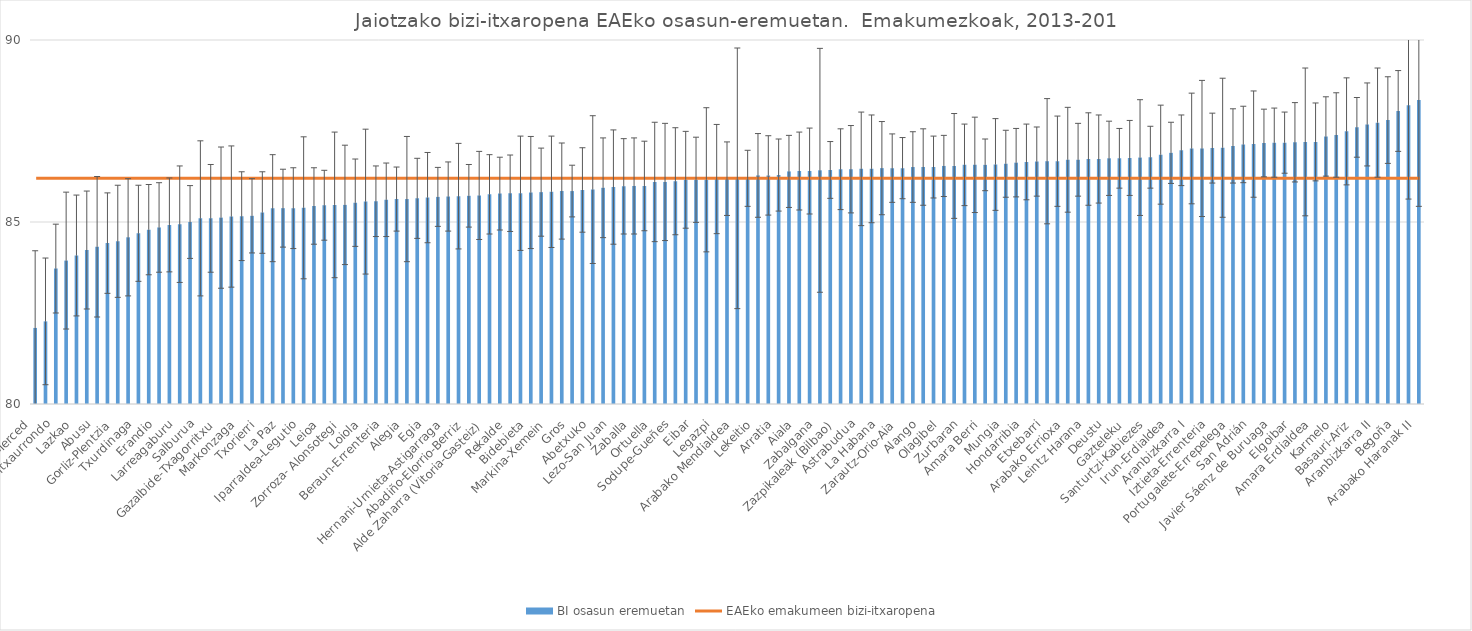
| Category | BI osasun eremuetan |
|---|---|
| La Merced  | 82.09 |
| Miribilla  | 82.27 |
| Intxaurrondo  | 83.72 |
| Otxarkoaga  | 83.94 |
| Lazkao  | 84.08 |
| Torrekua  | 84.23 |
| Abusu  | 84.32 |
| Santurtzi-Erdialdea-Mamariga  | 84.42 |
| Gorliz-Plentzia  | 84.47 |
| Kueto  | 84.58 |
| Txurdinaga  | 84.69 |
| Zuazo  | 84.79 |
| Erandio  | 84.85 |
| Portugalete-Buenavista  | 84.92 |
| Larreagaburu  | 84.94 |
| Zumaia-Zestoa-Getaria  | 85 |
| Salburua  | 85.1 |
| Zalla  | 85.1 |
| Gazalbide-Txagorritxu  | 85.12 |
| Lutxana  | 85.15 |
| Markonzaga  | 85.16 |
| Abanto-Muskiz  | 85.17 |
| Txorierri  | 85.26 |
| Balmaseda  | 85.38 |
| La Paz  | 85.38 |
| Altza-Roteta  | 85.38 |
| Iparraldea-Legutio  | 85.39 |
| Bermeo  | 85.44 |
| Leioa  | 85.46 |
| Urban  | 85.47 |
| Zorroza- Alonsotegi  | 85.47 |
| Ordizia  | 85.53 |
| Loiola  | 85.56 |
| Sopelana  | 85.57 |
| Beraun-Errenteria  | 85.61 |
| San Vicente  | 85.63 |
| Alegia  | 85.63 |
| Amorebieta  | 85.65 |
| Egia  | 85.67 |
| Durango  | 85.69 |
| Hernani-Urnieta-Astigarraga  | 85.7 |
| Oiartzun  | 85.71 |
| Abadiño-Elorrio-Berriz  | 85.72 |
| Arrontegi  | 85.73 |
| Alde Zaharra (Vitoria-Gasteiz)  | 85.76 |
| Basurtu  | 85.78 |
| Rekalde  | 85.79 |
| Deba  | 85.79 |
| Bidebieta  | 85.81 |
| Azkoitia  | 85.82 |
| Markina-Xemein  | 85.83 |
| Andoain  | 85.85 |
| Gros  | 85.85 |
| Tolosa  | 85.88 |
| Abetxuko  | 85.89 |
| Basauri-Kareaga  | 85.94 |
| Lezo-San Juan  | 85.96 |
| Lakuabizkarra  | 85.98 |
| Zaballa  | 85.99 |
| Arrigorriaga  | 85.99 |
| Ortuella  | 86.1 |
| Santutxu-Solokoetxe  | 86.1 |
| Sodupe-Gueñes  | 86.12 |
| Trapagaran  | 86.16 |
| Eibar  | 86.16 |
| Pasaia Antxo  | 86.16 |
| Legazpi  | 86.18 |
| Dumboa  | 86.19 |
| Arabako Mendialdea  | 86.2 |
| Etxaniz Suhiltzailea  | 86.2 |
| Lekeitio  | 86.28 |
| Ondarroa  | 86.28 |
| Arratia  | 86.29 |
| Gernika  | 86.39 |
| Aiala  | 86.4 |
| Gernikaldea  | 86.4 |
| Zabalgana  | 86.42 |
| Areeta  | 86.43 |
| Zazpikaleak (Bilbao)  | 86.45 |
| Alde Zaharra  | 86.45 |
| Astrabudua  | 86.46 |
| Ibarra  | 86.46 |
| La Habana  | 86.48 |
| Laudio  | 86.48 |
| Zarautz-Orio-Aia  | 86.48 |
| Portugalete-Castaños  | 86.51 |
| Alango  | 86.51 |
| Ondarreta  | 86.51 |
| Olagibel  | 86.54 |
| Azpeitia  | 86.54 |
| Zurbaran  | 86.57 |
| Zumarraga  | 86.57 |
| Amara Berri  | 86.57 |
| Ermua  | 86.58 |
| Mungia  | 86.6 |
| Beasain  | 86.63 |
| Hondarribia  | 86.65 |
| San Martin  | 86.66 |
| Etxebarri  | 86.67 |
| Pasaia San Pedro  | 86.67 |
| Arabako Errioxa  | 86.71 |
| Arrasate  | 86.71 |
| Leintz Harana  | 86.73 |
| Villabona  | 86.73 |
| Deustu  | 86.75 |
| Galdakao  | 86.75 |
| Gazteleku  | 86.76 |
| Zaramaga  | 86.77 |
| Santurtzi-Kabiezes  | 86.78 |
| Arabako Lautada  | 86.85 |
| Irun-Erdialdea  | 86.9 |
| Lasarte-Usurbil  | 86.97 |
| Aranbizkarra I  | 87.02 |
| Lakua-Arriaga  | 87.02 |
| Iztieta-Errenteria  | 87.03 |
| Sansomendi  | 87.04 |
| Portugalete-Errepelega  | 87.09 |
| Indautxu  | 87.13 |
| San Adrián  | 87.14 |
| San Inazio  | 87.17 |
| Javier Sáenz de Buruaga  | 87.18 |
| Algorta  | 87.18 |
| Elgoibar  | 87.19 |
| Iparraldea-Zuia  | 87.2 |
| Amara Erdialdea  | 87.2 |
| Bergara  | 87.35 |
| Karmelo  | 87.39 |
| Bolueta-Sagarminaga  | 87.49 |
| Basauri-Ariz  | 87.6 |
| Oñati  | 87.68 |
| Aranbizkarra II  | 87.73 |
| Olarizu  | 87.8 |
| Begoña  | 88.05 |
| Arabako Haranak I  | 88.21 |
| Arabako Haranak II  | 88.35 |